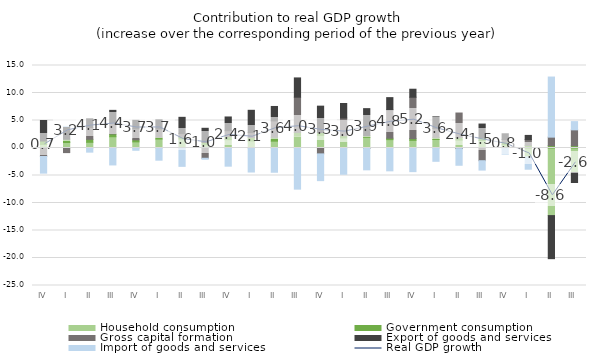
| Category | Household consumption | Government consumption | Gross capital formation | Export of goods and services | Import of goods and services |
|---|---|---|---|---|---|
| IV | 0.641 | 0.624 | -1.55 | 3.739 | -3.021 |
| I | 1.004 | 0.583 | -0.838 | 2.321 | 0.014 |
| II | 1.038 | 0.541 | 2.13 | 1.604 | -0.752 |
| III | 2.048 | 0.508 | 2.091 | 2.195 | -3.08 |
| IV | 1.116 | 0.367 | 2.006 | 1.544 | -0.414 |
| I | 1.633 | 0.335 | 1.497 | 1.661 | -2.217 |
| II | 1.645 | 0.328 | 0.652 | 2.952 | -3.338 |
| III | 0.612 | 0.396 | -1.866 | 2.575 | -0.182 |
| IV | 1.515 | 0.578 | 1.059 | 2.49 | -3.304 |
| I | 1.275 | 0.629 | 0.902 | 4.048 | -4.367 |
| II | 1.246 | 0.703 | 2.977 | 2.626 | -4.409 |
| III | 2.162 | 0.67 | 6.406 | 3.503 | -7.48 |
| IV | 2.292 | 0.522 | -1.069 | 4.796 | -4.866 |
| I | 1.834 | 0.409 | 3.202 | 2.65 | -4.77 |
| II | 1.947 | 0.296 | -0.095 | 4.914 | -3.875 |
| III | 1.52 | 0.258 | 5.133 | 2.247 | -4.153 |
| IV | 1.39 | 0.311 | 7.531 | 1.454 | -4.298 |
| I | 1.545 | 0.387 | 1.657 | 2.074 | -2.419 |
| II | 1.44 | 0.464 | 4.455 | -0.106 | -3.034 |
| III | 1.355 | 0.501 | -2.31 | 2.499 | -1.705 |
| IV | 0.59 | 0.488 | 0.458 | 1.054 | -1.105 |
| I | -1.616 | 0.475 | 1.055 | 0.759 | -2.242 |
| II | -12.29 | 0.427 | 1.547 | -7.831 | 10.928 |
| III | -4.456 | 0.419 | 2.881 | -1.814 | 1.494 |